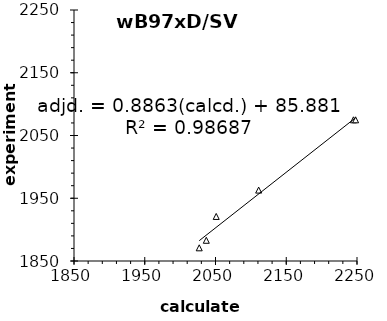
| Category | Series 0 |
|---|---|
| 2027.0 | 1871 |
| 2037.0 | 1883 |
| 2051.0 | 1921 |
| 2111.0 | 1963 |
| 2245.0 | 2075 |
| 2248.0 | 2075 |